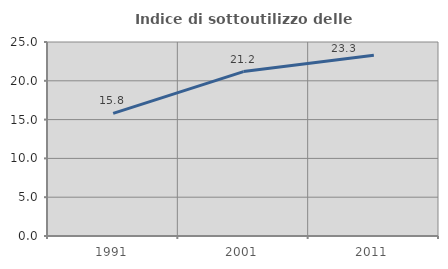
| Category | Indice di sottoutilizzo delle abitazioni  |
|---|---|
| 1991.0 | 15.803 |
| 2001.0 | 21.187 |
| 2011.0 | 23.304 |